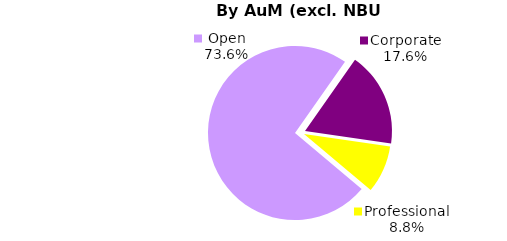
| Category | Series 0 |
|---|---|
| Open | 1180.406 |
| Corporate | 281.39 |
| Professional | 141.356 |